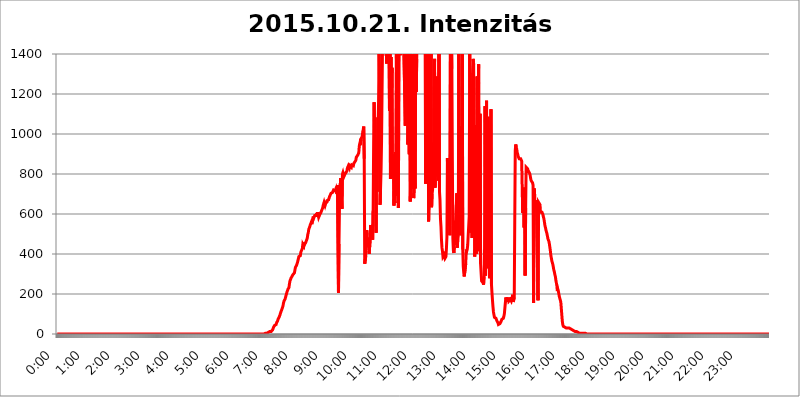
| Category | 2015.10.21. Intenzitás [W/m^2] |
|---|---|
| 0.0 | 0 |
| 0.0006944444444444445 | 0 |
| 0.001388888888888889 | 0 |
| 0.0020833333333333333 | 0 |
| 0.002777777777777778 | 0 |
| 0.003472222222222222 | 0 |
| 0.004166666666666667 | 0 |
| 0.004861111111111111 | 0 |
| 0.005555555555555556 | 0 |
| 0.0062499999999999995 | 0 |
| 0.006944444444444444 | 0 |
| 0.007638888888888889 | 0 |
| 0.008333333333333333 | 0 |
| 0.009027777777777779 | 0 |
| 0.009722222222222222 | 0 |
| 0.010416666666666666 | 0 |
| 0.011111111111111112 | 0 |
| 0.011805555555555555 | 0 |
| 0.012499999999999999 | 0 |
| 0.013194444444444444 | 0 |
| 0.013888888888888888 | 0 |
| 0.014583333333333332 | 0 |
| 0.015277777777777777 | 0 |
| 0.015972222222222224 | 0 |
| 0.016666666666666666 | 0 |
| 0.017361111111111112 | 0 |
| 0.018055555555555557 | 0 |
| 0.01875 | 0 |
| 0.019444444444444445 | 0 |
| 0.02013888888888889 | 0 |
| 0.020833333333333332 | 0 |
| 0.02152777777777778 | 0 |
| 0.022222222222222223 | 0 |
| 0.02291666666666667 | 0 |
| 0.02361111111111111 | 0 |
| 0.024305555555555556 | 0 |
| 0.024999999999999998 | 0 |
| 0.025694444444444447 | 0 |
| 0.02638888888888889 | 0 |
| 0.027083333333333334 | 0 |
| 0.027777777777777776 | 0 |
| 0.02847222222222222 | 0 |
| 0.029166666666666664 | 0 |
| 0.029861111111111113 | 0 |
| 0.030555555555555555 | 0 |
| 0.03125 | 0 |
| 0.03194444444444445 | 0 |
| 0.03263888888888889 | 0 |
| 0.03333333333333333 | 0 |
| 0.034027777777777775 | 0 |
| 0.034722222222222224 | 0 |
| 0.035416666666666666 | 0 |
| 0.036111111111111115 | 0 |
| 0.03680555555555556 | 0 |
| 0.0375 | 0 |
| 0.03819444444444444 | 0 |
| 0.03888888888888889 | 0 |
| 0.03958333333333333 | 0 |
| 0.04027777777777778 | 0 |
| 0.04097222222222222 | 0 |
| 0.041666666666666664 | 0 |
| 0.042361111111111106 | 0 |
| 0.04305555555555556 | 0 |
| 0.043750000000000004 | 0 |
| 0.044444444444444446 | 0 |
| 0.04513888888888889 | 0 |
| 0.04583333333333334 | 0 |
| 0.04652777777777778 | 0 |
| 0.04722222222222222 | 0 |
| 0.04791666666666666 | 0 |
| 0.04861111111111111 | 0 |
| 0.049305555555555554 | 0 |
| 0.049999999999999996 | 0 |
| 0.05069444444444445 | 0 |
| 0.051388888888888894 | 0 |
| 0.052083333333333336 | 0 |
| 0.05277777777777778 | 0 |
| 0.05347222222222222 | 0 |
| 0.05416666666666667 | 0 |
| 0.05486111111111111 | 0 |
| 0.05555555555555555 | 0 |
| 0.05625 | 0 |
| 0.05694444444444444 | 0 |
| 0.057638888888888885 | 0 |
| 0.05833333333333333 | 0 |
| 0.05902777777777778 | 0 |
| 0.059722222222222225 | 0 |
| 0.06041666666666667 | 0 |
| 0.061111111111111116 | 0 |
| 0.06180555555555556 | 0 |
| 0.0625 | 0 |
| 0.06319444444444444 | 0 |
| 0.06388888888888888 | 0 |
| 0.06458333333333334 | 0 |
| 0.06527777777777778 | 0 |
| 0.06597222222222222 | 0 |
| 0.06666666666666667 | 0 |
| 0.06736111111111111 | 0 |
| 0.06805555555555555 | 0 |
| 0.06874999999999999 | 0 |
| 0.06944444444444443 | 0 |
| 0.07013888888888889 | 0 |
| 0.07083333333333333 | 0 |
| 0.07152777777777779 | 0 |
| 0.07222222222222223 | 0 |
| 0.07291666666666667 | 0 |
| 0.07361111111111111 | 0 |
| 0.07430555555555556 | 0 |
| 0.075 | 0 |
| 0.07569444444444444 | 0 |
| 0.0763888888888889 | 0 |
| 0.07708333333333334 | 0 |
| 0.07777777777777778 | 0 |
| 0.07847222222222222 | 0 |
| 0.07916666666666666 | 0 |
| 0.0798611111111111 | 0 |
| 0.08055555555555556 | 0 |
| 0.08125 | 0 |
| 0.08194444444444444 | 0 |
| 0.08263888888888889 | 0 |
| 0.08333333333333333 | 0 |
| 0.08402777777777777 | 0 |
| 0.08472222222222221 | 0 |
| 0.08541666666666665 | 0 |
| 0.08611111111111112 | 0 |
| 0.08680555555555557 | 0 |
| 0.08750000000000001 | 0 |
| 0.08819444444444445 | 0 |
| 0.08888888888888889 | 0 |
| 0.08958333333333333 | 0 |
| 0.09027777777777778 | 0 |
| 0.09097222222222222 | 0 |
| 0.09166666666666667 | 0 |
| 0.09236111111111112 | 0 |
| 0.09305555555555556 | 0 |
| 0.09375 | 0 |
| 0.09444444444444444 | 0 |
| 0.09513888888888888 | 0 |
| 0.09583333333333333 | 0 |
| 0.09652777777777777 | 0 |
| 0.09722222222222222 | 0 |
| 0.09791666666666667 | 0 |
| 0.09861111111111111 | 0 |
| 0.09930555555555555 | 0 |
| 0.09999999999999999 | 0 |
| 0.10069444444444443 | 0 |
| 0.1013888888888889 | 0 |
| 0.10208333333333335 | 0 |
| 0.10277777777777779 | 0 |
| 0.10347222222222223 | 0 |
| 0.10416666666666667 | 0 |
| 0.10486111111111111 | 0 |
| 0.10555555555555556 | 0 |
| 0.10625 | 0 |
| 0.10694444444444444 | 0 |
| 0.1076388888888889 | 0 |
| 0.10833333333333334 | 0 |
| 0.10902777777777778 | 0 |
| 0.10972222222222222 | 0 |
| 0.1111111111111111 | 0 |
| 0.11180555555555556 | 0 |
| 0.11180555555555556 | 0 |
| 0.1125 | 0 |
| 0.11319444444444444 | 0 |
| 0.11388888888888889 | 0 |
| 0.11458333333333333 | 0 |
| 0.11527777777777777 | 0 |
| 0.11597222222222221 | 0 |
| 0.11666666666666665 | 0 |
| 0.1173611111111111 | 0 |
| 0.11805555555555557 | 0 |
| 0.11944444444444445 | 0 |
| 0.12013888888888889 | 0 |
| 0.12083333333333333 | 0 |
| 0.12152777777777778 | 0 |
| 0.12222222222222223 | 0 |
| 0.12291666666666667 | 0 |
| 0.12291666666666667 | 0 |
| 0.12361111111111112 | 0 |
| 0.12430555555555556 | 0 |
| 0.125 | 0 |
| 0.12569444444444444 | 0 |
| 0.12638888888888888 | 0 |
| 0.12708333333333333 | 0 |
| 0.16875 | 0 |
| 0.12847222222222224 | 0 |
| 0.12916666666666668 | 0 |
| 0.12986111111111112 | 0 |
| 0.13055555555555556 | 0 |
| 0.13125 | 0 |
| 0.13194444444444445 | 0 |
| 0.1326388888888889 | 0 |
| 0.13333333333333333 | 0 |
| 0.13402777777777777 | 0 |
| 0.13402777777777777 | 0 |
| 0.13472222222222222 | 0 |
| 0.13541666666666666 | 0 |
| 0.1361111111111111 | 0 |
| 0.13749999999999998 | 0 |
| 0.13819444444444443 | 0 |
| 0.1388888888888889 | 0 |
| 0.13958333333333334 | 0 |
| 0.14027777777777778 | 0 |
| 0.14097222222222222 | 0 |
| 0.14166666666666666 | 0 |
| 0.1423611111111111 | 0 |
| 0.14305555555555557 | 0 |
| 0.14375000000000002 | 0 |
| 0.14444444444444446 | 0 |
| 0.1451388888888889 | 0 |
| 0.1451388888888889 | 0 |
| 0.14652777777777778 | 0 |
| 0.14722222222222223 | 0 |
| 0.14791666666666667 | 0 |
| 0.1486111111111111 | 0 |
| 0.14930555555555555 | 0 |
| 0.15 | 0 |
| 0.15069444444444444 | 0 |
| 0.15138888888888888 | 0 |
| 0.15208333333333332 | 0 |
| 0.15277777777777776 | 0 |
| 0.15347222222222223 | 0 |
| 0.15416666666666667 | 0 |
| 0.15486111111111112 | 0 |
| 0.15555555555555556 | 0 |
| 0.15625 | 0 |
| 0.15694444444444444 | 0 |
| 0.15763888888888888 | 0 |
| 0.15833333333333333 | 0 |
| 0.15902777777777777 | 0 |
| 0.15972222222222224 | 0 |
| 0.16041666666666668 | 0 |
| 0.16111111111111112 | 0 |
| 0.16180555555555556 | 0 |
| 0.1625 | 0 |
| 0.16319444444444445 | 0 |
| 0.1638888888888889 | 0 |
| 0.16458333333333333 | 0 |
| 0.16527777777777777 | 0 |
| 0.16597222222222222 | 0 |
| 0.16666666666666666 | 0 |
| 0.1673611111111111 | 0 |
| 0.16805555555555554 | 0 |
| 0.16874999999999998 | 0 |
| 0.16944444444444443 | 0 |
| 0.17013888888888887 | 0 |
| 0.1708333333333333 | 0 |
| 0.17152777777777775 | 0 |
| 0.17222222222222225 | 0 |
| 0.1729166666666667 | 0 |
| 0.17361111111111113 | 0 |
| 0.17430555555555557 | 0 |
| 0.17500000000000002 | 0 |
| 0.17569444444444446 | 0 |
| 0.1763888888888889 | 0 |
| 0.17708333333333334 | 0 |
| 0.17777777777777778 | 0 |
| 0.17847222222222223 | 0 |
| 0.17916666666666667 | 0 |
| 0.1798611111111111 | 0 |
| 0.18055555555555555 | 0 |
| 0.18125 | 0 |
| 0.18194444444444444 | 0 |
| 0.1826388888888889 | 0 |
| 0.18333333333333335 | 0 |
| 0.1840277777777778 | 0 |
| 0.18472222222222223 | 0 |
| 0.18541666666666667 | 0 |
| 0.18611111111111112 | 0 |
| 0.18680555555555556 | 0 |
| 0.1875 | 0 |
| 0.18819444444444444 | 0 |
| 0.18888888888888888 | 0 |
| 0.18958333333333333 | 0 |
| 0.19027777777777777 | 0 |
| 0.1909722222222222 | 0 |
| 0.19166666666666665 | 0 |
| 0.19236111111111112 | 0 |
| 0.19305555555555554 | 0 |
| 0.19375 | 0 |
| 0.19444444444444445 | 0 |
| 0.1951388888888889 | 0 |
| 0.19583333333333333 | 0 |
| 0.19652777777777777 | 0 |
| 0.19722222222222222 | 0 |
| 0.19791666666666666 | 0 |
| 0.1986111111111111 | 0 |
| 0.19930555555555554 | 0 |
| 0.19999999999999998 | 0 |
| 0.20069444444444443 | 0 |
| 0.20138888888888887 | 0 |
| 0.2020833333333333 | 0 |
| 0.2027777777777778 | 0 |
| 0.2034722222222222 | 0 |
| 0.2041666666666667 | 0 |
| 0.20486111111111113 | 0 |
| 0.20555555555555557 | 0 |
| 0.20625000000000002 | 0 |
| 0.20694444444444446 | 0 |
| 0.2076388888888889 | 0 |
| 0.20833333333333334 | 0 |
| 0.20902777777777778 | 0 |
| 0.20972222222222223 | 0 |
| 0.21041666666666667 | 0 |
| 0.2111111111111111 | 0 |
| 0.21180555555555555 | 0 |
| 0.2125 | 0 |
| 0.21319444444444444 | 0 |
| 0.2138888888888889 | 0 |
| 0.21458333333333335 | 0 |
| 0.2152777777777778 | 0 |
| 0.21597222222222223 | 0 |
| 0.21666666666666667 | 0 |
| 0.21736111111111112 | 0 |
| 0.21805555555555556 | 0 |
| 0.21875 | 0 |
| 0.21944444444444444 | 0 |
| 0.22013888888888888 | 0 |
| 0.22083333333333333 | 0 |
| 0.22152777777777777 | 0 |
| 0.2222222222222222 | 0 |
| 0.22291666666666665 | 0 |
| 0.2236111111111111 | 0 |
| 0.22430555555555556 | 0 |
| 0.225 | 0 |
| 0.22569444444444445 | 0 |
| 0.2263888888888889 | 0 |
| 0.22708333333333333 | 0 |
| 0.22777777777777777 | 0 |
| 0.22847222222222222 | 0 |
| 0.22916666666666666 | 0 |
| 0.2298611111111111 | 0 |
| 0.23055555555555554 | 0 |
| 0.23124999999999998 | 0 |
| 0.23194444444444443 | 0 |
| 0.23263888888888887 | 0 |
| 0.2333333333333333 | 0 |
| 0.2340277777777778 | 0 |
| 0.2347222222222222 | 0 |
| 0.2354166666666667 | 0 |
| 0.23611111111111113 | 0 |
| 0.23680555555555557 | 0 |
| 0.23750000000000002 | 0 |
| 0.23819444444444446 | 0 |
| 0.2388888888888889 | 0 |
| 0.23958333333333334 | 0 |
| 0.24027777777777778 | 0 |
| 0.24097222222222223 | 0 |
| 0.24166666666666667 | 0 |
| 0.2423611111111111 | 0 |
| 0.24305555555555555 | 0 |
| 0.24375 | 0 |
| 0.24444444444444446 | 0 |
| 0.24513888888888888 | 0 |
| 0.24583333333333335 | 0 |
| 0.2465277777777778 | 0 |
| 0.24722222222222223 | 0 |
| 0.24791666666666667 | 0 |
| 0.24861111111111112 | 0 |
| 0.24930555555555556 | 0 |
| 0.25 | 0 |
| 0.25069444444444444 | 0 |
| 0.2513888888888889 | 0 |
| 0.2520833333333333 | 0 |
| 0.25277777777777777 | 0 |
| 0.2534722222222222 | 0 |
| 0.25416666666666665 | 0 |
| 0.2548611111111111 | 0 |
| 0.2555555555555556 | 0 |
| 0.25625000000000003 | 0 |
| 0.2569444444444445 | 0 |
| 0.2576388888888889 | 0 |
| 0.25833333333333336 | 0 |
| 0.2590277777777778 | 0 |
| 0.25972222222222224 | 0 |
| 0.2604166666666667 | 0 |
| 0.2611111111111111 | 0 |
| 0.26180555555555557 | 0 |
| 0.2625 | 0 |
| 0.26319444444444445 | 0 |
| 0.2638888888888889 | 0 |
| 0.26458333333333334 | 0 |
| 0.2652777777777778 | 0 |
| 0.2659722222222222 | 0 |
| 0.26666666666666666 | 0 |
| 0.2673611111111111 | 0 |
| 0.26805555555555555 | 0 |
| 0.26875 | 0 |
| 0.26944444444444443 | 0 |
| 0.2701388888888889 | 0 |
| 0.2708333333333333 | 0 |
| 0.27152777777777776 | 0 |
| 0.2722222222222222 | 0 |
| 0.27291666666666664 | 0 |
| 0.2736111111111111 | 0 |
| 0.2743055555555555 | 0 |
| 0.27499999999999997 | 0 |
| 0.27569444444444446 | 0 |
| 0.27638888888888885 | 0 |
| 0.27708333333333335 | 0 |
| 0.2777777777777778 | 0 |
| 0.27847222222222223 | 0 |
| 0.2791666666666667 | 0 |
| 0.2798611111111111 | 0 |
| 0.28055555555555556 | 0 |
| 0.28125 | 0 |
| 0.28194444444444444 | 0 |
| 0.2826388888888889 | 0 |
| 0.2833333333333333 | 0 |
| 0.28402777777777777 | 0 |
| 0.2847222222222222 | 0 |
| 0.28541666666666665 | 0 |
| 0.28611111111111115 | 0 |
| 0.28680555555555554 | 0 |
| 0.28750000000000003 | 0 |
| 0.2881944444444445 | 0 |
| 0.2888888888888889 | 0 |
| 0.28958333333333336 | 0 |
| 0.2902777777777778 | 0 |
| 0.29097222222222224 | 3.525 |
| 0.2916666666666667 | 3.525 |
| 0.2923611111111111 | 3.525 |
| 0.29305555555555557 | 3.525 |
| 0.29375 | 3.525 |
| 0.29444444444444445 | 3.525 |
| 0.2951388888888889 | 3.525 |
| 0.29583333333333334 | 7.887 |
| 0.2965277777777778 | 7.887 |
| 0.2972222222222222 | 7.887 |
| 0.29791666666666666 | 12.257 |
| 0.2986111111111111 | 12.257 |
| 0.29930555555555555 | 12.257 |
| 0.3 | 12.257 |
| 0.30069444444444443 | 16.636 |
| 0.3013888888888889 | 16.636 |
| 0.3020833333333333 | 21.024 |
| 0.30277777777777776 | 25.419 |
| 0.3034722222222222 | 34.234 |
| 0.30416666666666664 | 38.653 |
| 0.3048611111111111 | 43.079 |
| 0.3055555555555555 | 43.079 |
| 0.30624999999999997 | 47.511 |
| 0.3069444444444444 | 47.511 |
| 0.3076388888888889 | 56.398 |
| 0.30833333333333335 | 56.398 |
| 0.3090277777777778 | 65.31 |
| 0.30972222222222223 | 74.246 |
| 0.3104166666666667 | 78.722 |
| 0.3111111111111111 | 83.205 |
| 0.31180555555555556 | 87.692 |
| 0.3125 | 96.682 |
| 0.31319444444444444 | 105.69 |
| 0.3138888888888889 | 110.201 |
| 0.3145833333333333 | 119.235 |
| 0.31527777777777777 | 123.758 |
| 0.3159722222222222 | 132.814 |
| 0.31666666666666665 | 141.884 |
| 0.31736111111111115 | 155.509 |
| 0.31805555555555554 | 164.605 |
| 0.31875000000000003 | 169.156 |
| 0.3194444444444445 | 173.709 |
| 0.3201388888888889 | 178.264 |
| 0.32083333333333336 | 191.937 |
| 0.3215277777777778 | 201.058 |
| 0.32222222222222224 | 210.182 |
| 0.3229166666666667 | 214.746 |
| 0.3236111111111111 | 223.873 |
| 0.32430555555555557 | 228.436 |
| 0.325 | 233 |
| 0.32569444444444445 | 251.251 |
| 0.3263888888888889 | 264.932 |
| 0.32708333333333334 | 260.373 |
| 0.3277777777777778 | 278.603 |
| 0.3284722222222222 | 283.156 |
| 0.32916666666666666 | 287.709 |
| 0.3298611111111111 | 292.259 |
| 0.33055555555555555 | 296.808 |
| 0.33125 | 292.259 |
| 0.33194444444444443 | 292.259 |
| 0.3326388888888889 | 305.898 |
| 0.3333333333333333 | 319.517 |
| 0.3340277777777778 | 333.113 |
| 0.3347222222222222 | 337.639 |
| 0.3354166666666667 | 342.162 |
| 0.3361111111111111 | 337.639 |
| 0.3368055555555556 | 355.712 |
| 0.33749999999999997 | 360.221 |
| 0.33819444444444446 | 360.221 |
| 0.33888888888888885 | 387.202 |
| 0.33958333333333335 | 387.202 |
| 0.34027777777777773 | 391.685 |
| 0.34097222222222223 | 391.685 |
| 0.3416666666666666 | 409.574 |
| 0.3423611111111111 | 409.574 |
| 0.3430555555555555 | 409.574 |
| 0.34375 | 427.39 |
| 0.3444444444444445 | 449.551 |
| 0.3451388888888889 | 445.129 |
| 0.3458333333333334 | 440.702 |
| 0.34652777777777777 | 458.38 |
| 0.34722222222222227 | 449.551 |
| 0.34791666666666665 | 445.129 |
| 0.34861111111111115 | 458.38 |
| 0.34930555555555554 | 458.38 |
| 0.35000000000000003 | 462.786 |
| 0.3506944444444444 | 480.356 |
| 0.3513888888888889 | 497.836 |
| 0.3520833333333333 | 506.542 |
| 0.3527777777777778 | 523.88 |
| 0.3534722222222222 | 528.2 |
| 0.3541666666666667 | 536.82 |
| 0.3548611111111111 | 545.416 |
| 0.35555555555555557 | 549.704 |
| 0.35625 | 558.261 |
| 0.35694444444444445 | 549.704 |
| 0.3576388888888889 | 553.986 |
| 0.35833333333333334 | 571.049 |
| 0.3590277777777778 | 588.009 |
| 0.3597222222222222 | 579.542 |
| 0.36041666666666666 | 583.779 |
| 0.3611111111111111 | 592.233 |
| 0.36180555555555555 | 596.45 |
| 0.3625 | 596.45 |
| 0.36319444444444443 | 592.233 |
| 0.3638888888888889 | 604.864 |
| 0.3645833333333333 | 596.45 |
| 0.3652777777777778 | 609.062 |
| 0.3659722222222222 | 609.062 |
| 0.3666666666666667 | 583.779 |
| 0.3673611111111111 | 583.779 |
| 0.3680555555555556 | 596.45 |
| 0.36874999999999997 | 600.661 |
| 0.36944444444444446 | 604.864 |
| 0.37013888888888885 | 609.062 |
| 0.37083333333333335 | 617.436 |
| 0.37152777777777773 | 617.436 |
| 0.37222222222222223 | 629.948 |
| 0.3729166666666666 | 642.4 |
| 0.3736111111111111 | 650.667 |
| 0.3743055555555555 | 658.909 |
| 0.375 | 654.791 |
| 0.3756944444444445 | 642.4 |
| 0.3763888888888889 | 650.667 |
| 0.3770833333333334 | 663.019 |
| 0.37777777777777777 | 654.791 |
| 0.37847222222222227 | 667.123 |
| 0.37916666666666665 | 671.22 |
| 0.37986111111111115 | 671.22 |
| 0.38055555555555554 | 671.22 |
| 0.38125000000000003 | 679.395 |
| 0.3819444444444444 | 687.544 |
| 0.3826388888888889 | 683.473 |
| 0.3833333333333333 | 687.544 |
| 0.3840277777777778 | 703.762 |
| 0.3847222222222222 | 703.762 |
| 0.3854166666666667 | 703.762 |
| 0.3861111111111111 | 707.8 |
| 0.38680555555555557 | 707.8 |
| 0.3875 | 719.877 |
| 0.38819444444444445 | 723.889 |
| 0.3888888888888889 | 719.877 |
| 0.38958333333333334 | 715.858 |
| 0.3902777777777778 | 715.858 |
| 0.3909722222222222 | 727.896 |
| 0.39166666666666666 | 727.896 |
| 0.3923611111111111 | 699.717 |
| 0.39305555555555555 | 743.859 |
| 0.39375 | 739.877 |
| 0.39444444444444443 | 205.62 |
| 0.3951388888888889 | 449.551 |
| 0.3958333333333333 | 638.256 |
| 0.3965277777777778 | 629.948 |
| 0.3972222222222222 | 779.42 |
| 0.3979166666666667 | 779.42 |
| 0.3986111111111111 | 775.492 |
| 0.3993055555555556 | 625.784 |
| 0.39999999999999997 | 798.974 |
| 0.40069444444444446 | 806.757 |
| 0.40138888888888885 | 806.757 |
| 0.40208333333333335 | 787.258 |
| 0.40277777777777773 | 791.169 |
| 0.40347222222222223 | 798.974 |
| 0.4041666666666666 | 802.868 |
| 0.4048611111111111 | 806.757 |
| 0.4055555555555555 | 806.757 |
| 0.40625 | 814.519 |
| 0.4069444444444445 | 829.981 |
| 0.4076388888888889 | 829.981 |
| 0.4083333333333334 | 841.526 |
| 0.40902777777777777 | 841.526 |
| 0.40972222222222227 | 829.981 |
| 0.41041666666666665 | 841.526 |
| 0.41111111111111115 | 841.526 |
| 0.41180555555555554 | 837.682 |
| 0.41250000000000003 | 833.834 |
| 0.4131944444444444 | 845.365 |
| 0.4138888888888889 | 841.526 |
| 0.4145833333333333 | 841.526 |
| 0.4152777777777778 | 841.526 |
| 0.4159722222222222 | 853.029 |
| 0.4166666666666667 | 853.029 |
| 0.4173611111111111 | 860.676 |
| 0.41805555555555557 | 864.493 |
| 0.41875 | 868.305 |
| 0.41944444444444445 | 883.516 |
| 0.4201388888888889 | 879.719 |
| 0.42083333333333334 | 887.309 |
| 0.4215277777777778 | 894.885 |
| 0.4222222222222222 | 894.885 |
| 0.42291666666666666 | 906.223 |
| 0.4236111111111111 | 940.082 |
| 0.42430555555555555 | 951.327 |
| 0.425 | 943.832 |
| 0.42569444444444443 | 973.772 |
| 0.4263888888888889 | 977.508 |
| 0.4270833333333333 | 977.508 |
| 0.4277777777777778 | 988.714 |
| 0.4284722222222222 | 1011.118 |
| 0.4291666666666667 | 1022.323 |
| 0.4298611111111111 | 1037.277 |
| 0.4305555555555556 | 875.918 |
| 0.43124999999999997 | 351.198 |
| 0.43194444444444446 | 355.712 |
| 0.43263888888888885 | 387.202 |
| 0.43333333333333335 | 387.202 |
| 0.43402777777777773 | 519.555 |
| 0.43472222222222223 | 497.836 |
| 0.4354166666666666 | 458.38 |
| 0.4361111111111111 | 480.356 |
| 0.4368055555555555 | 431.833 |
| 0.4375 | 400.638 |
| 0.4381944444444445 | 396.164 |
| 0.4388888888888889 | 475.972 |
| 0.4395833333333334 | 545.416 |
| 0.44027777777777777 | 549.704 |
| 0.44097222222222227 | 545.416 |
| 0.44166666666666665 | 493.475 |
| 0.44236111111111115 | 471.582 |
| 0.44305555555555554 | 617.436 |
| 0.44375000000000003 | 955.071 |
| 0.4444444444444444 | 1158.689 |
| 0.4451388888888889 | 932.576 |
| 0.4458333333333333 | 1082.324 |
| 0.4465277777777778 | 719.877 |
| 0.4472222222222222 | 506.542 |
| 0.4479166666666667 | 932.576 |
| 0.4486111111111111 | 711.832 |
| 0.44930555555555557 | 966.295 |
| 0.45 | 1048.508 |
| 0.45069444444444445 | 1170.358 |
| 0.4513888888888889 | 1412.921 |
| 0.45208333333333334 | 1233.951 |
| 0.4527777777777778 | 646.537 |
| 0.4534722222222222 | 731.896 |
| 0.45416666666666666 | 818.392 |
| 0.4548611111111111 | 966.295 |
| 0.45555555555555555 | 966.295 |
| 0.45625 | 1451.653 |
| 0.45694444444444443 | 1481.743 |
| 0.4576388888888889 | 1471.609 |
| 0.4583333333333333 | 1471.609 |
| 0.4590277777777778 | 1507.556 |
| 0.4597222222222222 | 1502.338 |
| 0.4604166666666667 | 1476.663 |
| 0.4611111111111111 | 1486.851 |
| 0.4618055555555556 | 1352.994 |
| 0.46249999999999997 | 1471.609 |
| 0.46319444444444446 | 1466.581 |
| 0.46388888888888885 | 1471.609 |
| 0.46458333333333335 | 1436.949 |
| 0.46527777777777773 | 1507.556 |
| 0.46597222222222223 | 1116.426 |
| 0.4666666666666666 | 1466.581 |
| 0.4673611111111111 | 775.492 |
| 0.4680555555555555 | 1384.828 |
| 0.46875 | 1182.099 |
| 0.4694444444444445 | 1330.826 |
| 0.4701388888888889 | 779.42 |
| 0.4708333333333334 | 849.199 |
| 0.47152777777777777 | 898.668 |
| 0.47222222222222227 | 642.4 |
| 0.47291666666666665 | 723.889 |
| 0.47361111111111115 | 654.791 |
| 0.47430555555555554 | 909.996 |
| 0.47500000000000003 | 691.608 |
| 0.4756944444444444 | 1408.184 |
| 0.4763888888888889 | 1108.816 |
| 0.4770833333333333 | 1471.609 |
| 0.4777777777777778 | 1466.581 |
| 0.4784722222222222 | 629.948 |
| 0.4791666666666667 | 1441.826 |
| 0.4798611111111111 | 1422.462 |
| 0.48055555555555557 | 1417.68 |
| 0.48125 | 1394.106 |
| 0.48194444444444445 | 1412.921 |
| 0.4826388888888889 | 1417.68 |
| 0.48333333333333334 | 1422.462 |
| 0.4840277777777778 | 1422.462 |
| 0.4847222222222222 | 1422.462 |
| 0.48541666666666666 | 1422.462 |
| 0.4861111111111111 | 1432.097 |
| 0.48680555555555555 | 1432.097 |
| 0.4875 | 1436.949 |
| 0.48819444444444443 | 1041.019 |
| 0.4888888888888889 | 1466.581 |
| 0.4895833333333333 | 1352.994 |
| 0.4902777777777778 | 1481.743 |
| 0.4909722222222222 | 1432.097 |
| 0.4916666666666667 | 947.58 |
| 0.4923611111111111 | 1108.816 |
| 0.4930555555555556 | 1446.727 |
| 0.49374999999999997 | 898.668 |
| 0.49444444444444446 | 1471.609 |
| 0.49513888888888885 | 663.019 |
| 0.49583333333333335 | 798.974 |
| 0.49652777777777773 | 1502.338 |
| 0.49722222222222223 | 727.896 |
| 0.4979166666666666 | 1403.469 |
| 0.4986111111111111 | 1512.803 |
| 0.4993055555555555 | 1436.949 |
| 0.5 | 679.395 |
| 0.5006944444444444 | 775.492 |
| 0.5013888888888889 | 767.62 |
| 0.5020833333333333 | 727.896 |
| 0.5027777777777778 | 1502.338 |
| 0.5034722222222222 | 1209.807 |
| 0.5041666666666667 | 1375.633 |
| 0.5048611111111111 | 1512.803 |
| 0.5055555555555555 | 1497.148 |
| 0.50625 | 1512.803 |
| 0.5069444444444444 | 1512.803 |
| 0.5076388888888889 | 1497.148 |
| 0.5083333333333333 | 1497.148 |
| 0.5090277777777777 | 1408.184 |
| 0.5097222222222222 | 1461.58 |
| 0.5104166666666666 | 1451.653 |
| 0.5111111111111112 | 1446.727 |
| 0.5118055555555555 | 1441.826 |
| 0.5125000000000001 | 1461.58 |
| 0.5131944444444444 | 1436.949 |
| 0.513888888888889 | 1471.609 |
| 0.5145833333333333 | 1466.581 |
| 0.5152777777777778 | 1466.581 |
| 0.5159722222222222 | 1471.609 |
| 0.5166666666666667 | 751.803 |
| 0.517361111111111 | 1497.148 |
| 0.5180555555555556 | 1491.985 |
| 0.5187499999999999 | 984.98 |
| 0.5194444444444445 | 1486.851 |
| 0.5201388888888888 | 1304.795 |
| 0.5208333333333334 | 562.53 |
| 0.5215277777777778 | 667.123 |
| 0.5222222222222223 | 1539.476 |
| 0.5229166666666667 | 1502.338 |
| 0.5236111111111111 | 1041.019 |
| 0.5243055555555556 | 1481.743 |
| 0.525 | 634.105 |
| 0.5256944444444445 | 699.717 |
| 0.5263888888888889 | 719.877 |
| 0.5270833333333333 | 767.62 |
| 0.5277777777777778 | 958.814 |
| 0.5284722222222222 | 822.26 |
| 0.5291666666666667 | 1375.633 |
| 0.5298611111111111 | 731.896 |
| 0.5305555555555556 | 810.641 |
| 0.53125 | 1209.807 |
| 0.5319444444444444 | 1287.761 |
| 0.5326388888888889 | 883.516 |
| 0.5333333333333333 | 1041.019 |
| 0.5340277777777778 | 1074.789 |
| 0.5347222222222222 | 767.62 |
| 0.5354166666666667 | 1539.476 |
| 0.5361111111111111 | 711.832 |
| 0.5368055555555555 | 671.22 |
| 0.5375 | 575.299 |
| 0.5381944444444444 | 536.82 |
| 0.5388888888888889 | 471.582 |
| 0.5395833333333333 | 431.833 |
| 0.5402777777777777 | 414.035 |
| 0.5409722222222222 | 387.202 |
| 0.5416666666666666 | 387.202 |
| 0.5423611111111112 | 396.164 |
| 0.5430555555555555 | 387.202 |
| 0.5437500000000001 | 378.224 |
| 0.5444444444444444 | 378.224 |
| 0.545138888888889 | 387.202 |
| 0.5458333333333333 | 427.39 |
| 0.5465277777777778 | 484.735 |
| 0.5472222222222222 | 879.719 |
| 0.5479166666666667 | 883.516 |
| 0.548611111111111 | 553.986 |
| 0.5493055555555556 | 600.661 |
| 0.5499999999999999 | 579.542 |
| 0.5506944444444445 | 493.475 |
| 0.5513888888888888 | 1441.826 |
| 0.5520833333333334 | 1403.469 |
| 0.5527777777777778 | 1471.609 |
| 0.5534722222222223 | 1326.445 |
| 0.5541666666666667 | 864.493 |
| 0.5548611111111111 | 475.972 |
| 0.5555555555555556 | 418.492 |
| 0.55625 | 405.108 |
| 0.5569444444444445 | 436.27 |
| 0.5576388888888889 | 566.793 |
| 0.5583333333333333 | 467.187 |
| 0.5590277777777778 | 467.187 |
| 0.5597222222222222 | 646.537 |
| 0.5604166666666667 | 703.762 |
| 0.5611111111111111 | 431.833 |
| 0.5618055555555556 | 427.39 |
| 0.5625 | 523.88 |
| 0.5631944444444444 | 1422.462 |
| 0.5638888888888889 | 558.261 |
| 0.5645833333333333 | 1018.587 |
| 0.5652777777777778 | 1037.277 |
| 0.5659722222222222 | 493.475 |
| 0.5666666666666667 | 679.395 |
| 0.5673611111111111 | 629.948 |
| 0.5680555555555555 | 1417.68 |
| 0.56875 | 422.943 |
| 0.5694444444444444 | 337.639 |
| 0.5701388888888889 | 305.898 |
| 0.5708333333333333 | 287.709 |
| 0.5715277777777777 | 287.709 |
| 0.5722222222222222 | 292.259 |
| 0.5729166666666666 | 351.198 |
| 0.5736111111111112 | 422.943 |
| 0.5743055555555555 | 414.035 |
| 0.5750000000000001 | 422.943 |
| 0.5756944444444444 | 445.129 |
| 0.576388888888889 | 449.551 |
| 0.5770833333333333 | 445.129 |
| 0.5777777777777778 | 588.009 |
| 0.5784722222222222 | 1408.184 |
| 0.5791666666666667 | 1197.876 |
| 0.579861111111111 | 506.542 |
| 0.5805555555555556 | 528.2 |
| 0.5812499999999999 | 1254.387 |
| 0.5819444444444445 | 480.356 |
| 0.5826388888888888 | 1304.795 |
| 0.5833333333333334 | 1375.633 |
| 0.5840277777777778 | 1348.524 |
| 0.5847222222222223 | 875.918 |
| 0.5854166666666667 | 387.202 |
| 0.5861111111111111 | 422.943 |
| 0.5868055555555556 | 1044.762 |
| 0.5875 | 671.22 |
| 0.5881944444444445 | 400.638 |
| 0.5888888888888889 | 1287.761 |
| 0.5895833333333333 | 1283.541 |
| 0.5902777777777778 | 739.877 |
| 0.5909722222222222 | 1348.524 |
| 0.5916666666666667 | 414.035 |
| 0.5923611111111111 | 422.943 |
| 0.5930555555555556 | 1101.226 |
| 0.59375 | 351.198 |
| 0.5944444444444444 | 355.712 |
| 0.5951388888888889 | 264.932 |
| 0.5958333333333333 | 264.932 |
| 0.5965277777777778 | 269.49 |
| 0.5972222222222222 | 255.813 |
| 0.5979166666666667 | 246.689 |
| 0.5986111111111111 | 287.709 |
| 0.5993055555555555 | 427.39 |
| 0.6 | 1139.384 |
| 0.6006944444444444 | 292.259 |
| 0.6013888888888889 | 287.709 |
| 0.6020833333333333 | 1166.46 |
| 0.6027777777777777 | 328.584 |
| 0.6034722222222222 | 970.034 |
| 0.6041666666666666 | 1086.097 |
| 0.6048611111111112 | 1011.118 |
| 0.6055555555555555 | 502.192 |
| 0.6062500000000001 | 278.603 |
| 0.6069444444444444 | 301.354 |
| 0.607638888888889 | 324.052 |
| 0.6083333333333333 | 1124.056 |
| 0.6090277777777778 | 246.689 |
| 0.6097222222222222 | 205.62 |
| 0.6104166666666667 | 169.156 |
| 0.611111111111111 | 137.347 |
| 0.6118055555555556 | 110.201 |
| 0.6124999999999999 | 96.682 |
| 0.6131944444444445 | 83.205 |
| 0.6138888888888888 | 83.205 |
| 0.6145833333333334 | 78.722 |
| 0.6152777777777778 | 78.722 |
| 0.6159722222222223 | 74.246 |
| 0.6166666666666667 | 65.31 |
| 0.6173611111111111 | 60.85 |
| 0.6180555555555556 | 56.398 |
| 0.61875 | 47.511 |
| 0.6194444444444445 | 47.511 |
| 0.6201388888888889 | 47.511 |
| 0.6208333333333333 | 51.951 |
| 0.6215277777777778 | 56.398 |
| 0.6222222222222222 | 60.85 |
| 0.6229166666666667 | 65.31 |
| 0.6236111111111111 | 74.246 |
| 0.6243055555555556 | 78.722 |
| 0.625 | 78.722 |
| 0.6256944444444444 | 78.722 |
| 0.6263888888888889 | 87.692 |
| 0.6270833333333333 | 101.184 |
| 0.6277777777777778 | 128.284 |
| 0.6284722222222222 | 155.509 |
| 0.6291666666666667 | 182.82 |
| 0.6298611111111111 | 187.378 |
| 0.6305555555555555 | 178.264 |
| 0.63125 | 160.056 |
| 0.6319444444444444 | 173.709 |
| 0.6326388888888889 | 182.82 |
| 0.6333333333333333 | 164.605 |
| 0.6340277777777777 | 164.605 |
| 0.6347222222222222 | 164.605 |
| 0.6354166666666666 | 173.709 |
| 0.6361111111111112 | 178.264 |
| 0.6368055555555555 | 164.605 |
| 0.6375000000000001 | 169.156 |
| 0.6381944444444444 | 182.82 |
| 0.638888888888889 | 196.497 |
| 0.6395833333333333 | 160.056 |
| 0.6402777777777778 | 164.605 |
| 0.6409722222222222 | 182.82 |
| 0.6416666666666667 | 566.793 |
| 0.642361111111111 | 917.534 |
| 0.6430555555555556 | 947.58 |
| 0.6437499999999999 | 932.576 |
| 0.6444444444444445 | 925.06 |
| 0.6451388888888888 | 906.223 |
| 0.6458333333333334 | 898.668 |
| 0.6465277777777778 | 887.309 |
| 0.6472222222222223 | 887.309 |
| 0.6479166666666667 | 875.918 |
| 0.6486111111111111 | 872.114 |
| 0.6493055555555556 | 872.114 |
| 0.65 | 875.918 |
| 0.6506944444444445 | 872.114 |
| 0.6513888888888889 | 864.493 |
| 0.6520833333333333 | 860.676 |
| 0.6527777777777778 | 604.864 |
| 0.6534722222222222 | 629.948 |
| 0.6541666666666667 | 727.896 |
| 0.6548611111111111 | 532.513 |
| 0.6555555555555556 | 731.896 |
| 0.65625 | 292.259 |
| 0.6569444444444444 | 629.948 |
| 0.6576388888888889 | 833.834 |
| 0.6583333333333333 | 829.981 |
| 0.6590277777777778 | 833.834 |
| 0.6597222222222222 | 826.123 |
| 0.6604166666666667 | 818.392 |
| 0.6611111111111111 | 818.392 |
| 0.6618055555555555 | 814.519 |
| 0.6625 | 802.868 |
| 0.6631944444444444 | 795.074 |
| 0.6638888888888889 | 779.42 |
| 0.6645833333333333 | 767.62 |
| 0.6652777777777777 | 767.62 |
| 0.6659722222222222 | 763.674 |
| 0.6666666666666666 | 755.766 |
| 0.6673611111111111 | 743.859 |
| 0.6680555555555556 | 155.509 |
| 0.6687500000000001 | 727.896 |
| 0.6694444444444444 | 711.832 |
| 0.6701388888888888 | 625.784 |
| 0.6708333333333334 | 667.123 |
| 0.6715277777777778 | 658.909 |
| 0.6722222222222222 | 667.123 |
| 0.6729166666666666 | 667.123 |
| 0.6736111111111112 | 667.123 |
| 0.6743055555555556 | 169.156 |
| 0.6749999999999999 | 658.909 |
| 0.6756944444444444 | 658.909 |
| 0.6763888888888889 | 658.909 |
| 0.6770833333333334 | 646.537 |
| 0.6777777777777777 | 609.062 |
| 0.6784722222222223 | 613.252 |
| 0.6791666666666667 | 609.062 |
| 0.6798611111111111 | 609.062 |
| 0.6805555555555555 | 604.864 |
| 0.68125 | 596.45 |
| 0.6819444444444445 | 583.779 |
| 0.6826388888888889 | 575.299 |
| 0.6833333333333332 | 558.261 |
| 0.6840277777777778 | 541.121 |
| 0.6847222222222222 | 532.513 |
| 0.6854166666666667 | 519.555 |
| 0.686111111111111 | 510.885 |
| 0.6868055555555556 | 502.192 |
| 0.6875 | 489.108 |
| 0.6881944444444444 | 475.972 |
| 0.688888888888889 | 471.582 |
| 0.6895833333333333 | 462.786 |
| 0.6902777777777778 | 449.551 |
| 0.6909722222222222 | 431.833 |
| 0.6916666666666668 | 414.035 |
| 0.6923611111111111 | 391.685 |
| 0.6930555555555555 | 378.224 |
| 0.69375 | 364.728 |
| 0.6944444444444445 | 355.712 |
| 0.6951388888888889 | 346.682 |
| 0.6958333333333333 | 333.113 |
| 0.6965277777777777 | 319.517 |
| 0.6972222222222223 | 310.44 |
| 0.6979166666666666 | 296.808 |
| 0.6986111111111111 | 287.709 |
| 0.6993055555555556 | 269.49 |
| 0.7000000000000001 | 255.813 |
| 0.7006944444444444 | 242.127 |
| 0.7013888888888888 | 214.746 |
| 0.7020833333333334 | 223.873 |
| 0.7027777777777778 | 214.746 |
| 0.7034722222222222 | 201.058 |
| 0.7041666666666666 | 187.378 |
| 0.7048611111111112 | 178.264 |
| 0.7055555555555556 | 169.156 |
| 0.7062499999999999 | 160.056 |
| 0.7069444444444444 | 128.284 |
| 0.7076388888888889 | 96.682 |
| 0.7083333333333334 | 65.31 |
| 0.7090277777777777 | 47.511 |
| 0.7097222222222223 | 38.653 |
| 0.7104166666666667 | 38.653 |
| 0.7111111111111111 | 34.234 |
| 0.7118055555555555 | 34.234 |
| 0.7125 | 34.234 |
| 0.7131944444444445 | 34.234 |
| 0.7138888888888889 | 29.823 |
| 0.7145833333333332 | 29.823 |
| 0.7152777777777778 | 29.823 |
| 0.7159722222222222 | 29.823 |
| 0.7166666666666667 | 25.419 |
| 0.717361111111111 | 29.823 |
| 0.7180555555555556 | 29.823 |
| 0.71875 | 25.419 |
| 0.7194444444444444 | 25.419 |
| 0.720138888888889 | 25.419 |
| 0.7208333333333333 | 25.419 |
| 0.7215277777777778 | 21.024 |
| 0.7222222222222222 | 21.024 |
| 0.7229166666666668 | 21.024 |
| 0.7236111111111111 | 21.024 |
| 0.7243055555555555 | 16.636 |
| 0.725 | 16.636 |
| 0.7256944444444445 | 16.636 |
| 0.7263888888888889 | 12.257 |
| 0.7270833333333333 | 12.257 |
| 0.7277777777777777 | 12.257 |
| 0.7284722222222223 | 12.257 |
| 0.7291666666666666 | 7.887 |
| 0.7298611111111111 | 7.887 |
| 0.7305555555555556 | 7.887 |
| 0.7312500000000001 | 7.887 |
| 0.7319444444444444 | 3.525 |
| 0.7326388888888888 | 3.525 |
| 0.7333333333333334 | 3.525 |
| 0.7340277777777778 | 3.525 |
| 0.7347222222222222 | 3.525 |
| 0.7354166666666666 | 3.525 |
| 0.7361111111111112 | 3.525 |
| 0.7368055555555556 | 3.525 |
| 0.7374999999999999 | 3.525 |
| 0.7381944444444444 | 3.525 |
| 0.7388888888888889 | 3.525 |
| 0.7395833333333334 | 3.525 |
| 0.7402777777777777 | 0 |
| 0.7409722222222223 | 3.525 |
| 0.7416666666666667 | 0 |
| 0.7423611111111111 | 0 |
| 0.7430555555555555 | 0 |
| 0.74375 | 0 |
| 0.7444444444444445 | 0 |
| 0.7451388888888889 | 0 |
| 0.7458333333333332 | 0 |
| 0.7465277777777778 | 0 |
| 0.7472222222222222 | 0 |
| 0.7479166666666667 | 0 |
| 0.748611111111111 | 0 |
| 0.7493055555555556 | 0 |
| 0.75 | 0 |
| 0.7506944444444444 | 0 |
| 0.751388888888889 | 0 |
| 0.7520833333333333 | 0 |
| 0.7527777777777778 | 0 |
| 0.7534722222222222 | 0 |
| 0.7541666666666668 | 0 |
| 0.7548611111111111 | 0 |
| 0.7555555555555555 | 0 |
| 0.75625 | 0 |
| 0.7569444444444445 | 0 |
| 0.7576388888888889 | 0 |
| 0.7583333333333333 | 0 |
| 0.7590277777777777 | 0 |
| 0.7597222222222223 | 0 |
| 0.7604166666666666 | 0 |
| 0.7611111111111111 | 0 |
| 0.7618055555555556 | 0 |
| 0.7625000000000001 | 0 |
| 0.7631944444444444 | 0 |
| 0.7638888888888888 | 0 |
| 0.7645833333333334 | 0 |
| 0.7652777777777778 | 0 |
| 0.7659722222222222 | 0 |
| 0.7666666666666666 | 0 |
| 0.7673611111111112 | 0 |
| 0.7680555555555556 | 0 |
| 0.7687499999999999 | 0 |
| 0.7694444444444444 | 0 |
| 0.7701388888888889 | 0 |
| 0.7708333333333334 | 0 |
| 0.7715277777777777 | 0 |
| 0.7722222222222223 | 0 |
| 0.7729166666666667 | 0 |
| 0.7736111111111111 | 0 |
| 0.7743055555555555 | 0 |
| 0.775 | 0 |
| 0.7756944444444445 | 0 |
| 0.7763888888888889 | 0 |
| 0.7770833333333332 | 0 |
| 0.7777777777777778 | 0 |
| 0.7784722222222222 | 0 |
| 0.7791666666666667 | 0 |
| 0.779861111111111 | 0 |
| 0.7805555555555556 | 0 |
| 0.78125 | 0 |
| 0.7819444444444444 | 0 |
| 0.782638888888889 | 0 |
| 0.7833333333333333 | 0 |
| 0.7840277777777778 | 0 |
| 0.7847222222222222 | 0 |
| 0.7854166666666668 | 0 |
| 0.7861111111111111 | 0 |
| 0.7868055555555555 | 0 |
| 0.7875 | 0 |
| 0.7881944444444445 | 0 |
| 0.7888888888888889 | 0 |
| 0.7895833333333333 | 0 |
| 0.7902777777777777 | 0 |
| 0.7909722222222223 | 0 |
| 0.7916666666666666 | 0 |
| 0.7923611111111111 | 0 |
| 0.7930555555555556 | 0 |
| 0.7937500000000001 | 0 |
| 0.7944444444444444 | 0 |
| 0.7951388888888888 | 0 |
| 0.7958333333333334 | 0 |
| 0.7965277777777778 | 0 |
| 0.7972222222222222 | 0 |
| 0.7979166666666666 | 0 |
| 0.7986111111111112 | 0 |
| 0.7993055555555556 | 0 |
| 0.7999999999999999 | 0 |
| 0.8006944444444444 | 0 |
| 0.8013888888888889 | 0 |
| 0.8020833333333334 | 0 |
| 0.8027777777777777 | 0 |
| 0.8034722222222223 | 0 |
| 0.8041666666666667 | 0 |
| 0.8048611111111111 | 0 |
| 0.8055555555555555 | 0 |
| 0.80625 | 0 |
| 0.8069444444444445 | 0 |
| 0.8076388888888889 | 0 |
| 0.8083333333333332 | 0 |
| 0.8090277777777778 | 0 |
| 0.8097222222222222 | 0 |
| 0.8104166666666667 | 0 |
| 0.811111111111111 | 0 |
| 0.8118055555555556 | 0 |
| 0.8125 | 0 |
| 0.8131944444444444 | 0 |
| 0.813888888888889 | 0 |
| 0.8145833333333333 | 0 |
| 0.8152777777777778 | 0 |
| 0.8159722222222222 | 0 |
| 0.8166666666666668 | 0 |
| 0.8173611111111111 | 0 |
| 0.8180555555555555 | 0 |
| 0.81875 | 0 |
| 0.8194444444444445 | 0 |
| 0.8201388888888889 | 0 |
| 0.8208333333333333 | 0 |
| 0.8215277777777777 | 0 |
| 0.8222222222222223 | 0 |
| 0.8229166666666666 | 0 |
| 0.8236111111111111 | 0 |
| 0.8243055555555556 | 0 |
| 0.8250000000000001 | 0 |
| 0.8256944444444444 | 0 |
| 0.8263888888888888 | 0 |
| 0.8270833333333334 | 0 |
| 0.8277777777777778 | 0 |
| 0.8284722222222222 | 0 |
| 0.8291666666666666 | 0 |
| 0.8298611111111112 | 0 |
| 0.8305555555555556 | 0 |
| 0.8312499999999999 | 0 |
| 0.8319444444444444 | 0 |
| 0.8326388888888889 | 0 |
| 0.8333333333333334 | 0 |
| 0.8340277777777777 | 0 |
| 0.8347222222222223 | 0 |
| 0.8354166666666667 | 0 |
| 0.8361111111111111 | 0 |
| 0.8368055555555555 | 0 |
| 0.8375 | 0 |
| 0.8381944444444445 | 0 |
| 0.8388888888888889 | 0 |
| 0.8395833333333332 | 0 |
| 0.8402777777777778 | 0 |
| 0.8409722222222222 | 0 |
| 0.8416666666666667 | 0 |
| 0.842361111111111 | 0 |
| 0.8430555555555556 | 0 |
| 0.84375 | 0 |
| 0.8444444444444444 | 0 |
| 0.845138888888889 | 0 |
| 0.8458333333333333 | 0 |
| 0.8465277777777778 | 0 |
| 0.8472222222222222 | 0 |
| 0.8479166666666668 | 0 |
| 0.8486111111111111 | 0 |
| 0.8493055555555555 | 0 |
| 0.85 | 0 |
| 0.8506944444444445 | 0 |
| 0.8513888888888889 | 0 |
| 0.8520833333333333 | 0 |
| 0.8527777777777777 | 0 |
| 0.8534722222222223 | 0 |
| 0.8541666666666666 | 0 |
| 0.8548611111111111 | 0 |
| 0.8555555555555556 | 0 |
| 0.8562500000000001 | 0 |
| 0.8569444444444444 | 0 |
| 0.8576388888888888 | 0 |
| 0.8583333333333334 | 0 |
| 0.8590277777777778 | 0 |
| 0.8597222222222222 | 0 |
| 0.8604166666666666 | 0 |
| 0.8611111111111112 | 0 |
| 0.8618055555555556 | 0 |
| 0.8624999999999999 | 0 |
| 0.8631944444444444 | 0 |
| 0.8638888888888889 | 0 |
| 0.8645833333333334 | 0 |
| 0.8652777777777777 | 0 |
| 0.8659722222222223 | 0 |
| 0.8666666666666667 | 0 |
| 0.8673611111111111 | 0 |
| 0.8680555555555555 | 0 |
| 0.86875 | 0 |
| 0.8694444444444445 | 0 |
| 0.8701388888888889 | 0 |
| 0.8708333333333332 | 0 |
| 0.8715277777777778 | 0 |
| 0.8722222222222222 | 0 |
| 0.8729166666666667 | 0 |
| 0.873611111111111 | 0 |
| 0.8743055555555556 | 0 |
| 0.875 | 0 |
| 0.8756944444444444 | 0 |
| 0.876388888888889 | 0 |
| 0.8770833333333333 | 0 |
| 0.8777777777777778 | 0 |
| 0.8784722222222222 | 0 |
| 0.8791666666666668 | 0 |
| 0.8798611111111111 | 0 |
| 0.8805555555555555 | 0 |
| 0.88125 | 0 |
| 0.8819444444444445 | 0 |
| 0.8826388888888889 | 0 |
| 0.8833333333333333 | 0 |
| 0.8840277777777777 | 0 |
| 0.8847222222222223 | 0 |
| 0.8854166666666666 | 0 |
| 0.8861111111111111 | 0 |
| 0.8868055555555556 | 0 |
| 0.8875000000000001 | 0 |
| 0.8881944444444444 | 0 |
| 0.8888888888888888 | 0 |
| 0.8895833333333334 | 0 |
| 0.8902777777777778 | 0 |
| 0.8909722222222222 | 0 |
| 0.8916666666666666 | 0 |
| 0.8923611111111112 | 0 |
| 0.8930555555555556 | 0 |
| 0.8937499999999999 | 0 |
| 0.8944444444444444 | 0 |
| 0.8951388888888889 | 0 |
| 0.8958333333333334 | 0 |
| 0.8965277777777777 | 0 |
| 0.8972222222222223 | 0 |
| 0.8979166666666667 | 0 |
| 0.8986111111111111 | 0 |
| 0.8993055555555555 | 0 |
| 0.9 | 0 |
| 0.9006944444444445 | 0 |
| 0.9013888888888889 | 0 |
| 0.9020833333333332 | 0 |
| 0.9027777777777778 | 0 |
| 0.9034722222222222 | 0 |
| 0.9041666666666667 | 0 |
| 0.904861111111111 | 0 |
| 0.9055555555555556 | 0 |
| 0.90625 | 0 |
| 0.9069444444444444 | 0 |
| 0.907638888888889 | 0 |
| 0.9083333333333333 | 0 |
| 0.9090277777777778 | 0 |
| 0.9097222222222222 | 0 |
| 0.9104166666666668 | 0 |
| 0.9111111111111111 | 0 |
| 0.9118055555555555 | 0 |
| 0.9125 | 0 |
| 0.9131944444444445 | 0 |
| 0.9138888888888889 | 0 |
| 0.9145833333333333 | 0 |
| 0.9152777777777777 | 0 |
| 0.9159722222222223 | 0 |
| 0.9166666666666666 | 0 |
| 0.9173611111111111 | 0 |
| 0.9180555555555556 | 0 |
| 0.9187500000000001 | 0 |
| 0.9194444444444444 | 0 |
| 0.9201388888888888 | 0 |
| 0.9208333333333334 | 0 |
| 0.9215277777777778 | 0 |
| 0.9222222222222222 | 0 |
| 0.9229166666666666 | 0 |
| 0.9236111111111112 | 0 |
| 0.9243055555555556 | 0 |
| 0.9249999999999999 | 0 |
| 0.9256944444444444 | 0 |
| 0.9263888888888889 | 0 |
| 0.9270833333333334 | 0 |
| 0.9277777777777777 | 0 |
| 0.9284722222222223 | 0 |
| 0.9291666666666667 | 0 |
| 0.9298611111111111 | 0 |
| 0.9305555555555555 | 0 |
| 0.93125 | 0 |
| 0.9319444444444445 | 0 |
| 0.9326388888888889 | 0 |
| 0.9333333333333332 | 0 |
| 0.9340277777777778 | 0 |
| 0.9347222222222222 | 0 |
| 0.9354166666666667 | 0 |
| 0.936111111111111 | 0 |
| 0.9368055555555556 | 0 |
| 0.9375 | 0 |
| 0.9381944444444444 | 0 |
| 0.938888888888889 | 0 |
| 0.9395833333333333 | 0 |
| 0.9402777777777778 | 0 |
| 0.9409722222222222 | 0 |
| 0.9416666666666668 | 0 |
| 0.9423611111111111 | 0 |
| 0.9430555555555555 | 0 |
| 0.94375 | 0 |
| 0.9444444444444445 | 0 |
| 0.9451388888888889 | 0 |
| 0.9458333333333333 | 0 |
| 0.9465277777777777 | 0 |
| 0.9472222222222223 | 0 |
| 0.9479166666666666 | 0 |
| 0.9486111111111111 | 0 |
| 0.9493055555555556 | 0 |
| 0.9500000000000001 | 0 |
| 0.9506944444444444 | 0 |
| 0.9513888888888888 | 0 |
| 0.9520833333333334 | 0 |
| 0.9527777777777778 | 0 |
| 0.9534722222222222 | 0 |
| 0.9541666666666666 | 0 |
| 0.9548611111111112 | 0 |
| 0.9555555555555556 | 0 |
| 0.9562499999999999 | 0 |
| 0.9569444444444444 | 0 |
| 0.9576388888888889 | 0 |
| 0.9583333333333334 | 0 |
| 0.9590277777777777 | 0 |
| 0.9597222222222223 | 0 |
| 0.9604166666666667 | 0 |
| 0.9611111111111111 | 0 |
| 0.9618055555555555 | 0 |
| 0.9625 | 0 |
| 0.9631944444444445 | 0 |
| 0.9638888888888889 | 0 |
| 0.9645833333333332 | 0 |
| 0.9652777777777778 | 0 |
| 0.9659722222222222 | 0 |
| 0.9666666666666667 | 0 |
| 0.967361111111111 | 0 |
| 0.9680555555555556 | 0 |
| 0.96875 | 0 |
| 0.9694444444444444 | 0 |
| 0.970138888888889 | 0 |
| 0.9708333333333333 | 0 |
| 0.9715277777777778 | 0 |
| 0.9722222222222222 | 0 |
| 0.9729166666666668 | 0 |
| 0.9736111111111111 | 0 |
| 0.9743055555555555 | 0 |
| 0.975 | 0 |
| 0.9756944444444445 | 0 |
| 0.9763888888888889 | 0 |
| 0.9770833333333333 | 0 |
| 0.9777777777777777 | 0 |
| 0.9784722222222223 | 0 |
| 0.9791666666666666 | 0 |
| 0.9798611111111111 | 0 |
| 0.9805555555555556 | 0 |
| 0.9812500000000001 | 0 |
| 0.9819444444444444 | 0 |
| 0.9826388888888888 | 0 |
| 0.9833333333333334 | 0 |
| 0.9840277777777778 | 0 |
| 0.9847222222222222 | 0 |
| 0.9854166666666666 | 0 |
| 0.9861111111111112 | 0 |
| 0.9868055555555556 | 0 |
| 0.9874999999999999 | 0 |
| 0.9881944444444444 | 0 |
| 0.9888888888888889 | 0 |
| 0.9895833333333334 | 0 |
| 0.9902777777777777 | 0 |
| 0.9909722222222223 | 0 |
| 0.9916666666666667 | 0 |
| 0.9923611111111111 | 0 |
| 0.9930555555555555 | 0 |
| 0.99375 | 0 |
| 0.9944444444444445 | 0 |
| 0.9951388888888889 | 0 |
| 0.9958333333333332 | 0 |
| 0.9965277777777778 | 0 |
| 0.9972222222222222 | 0 |
| 0.9979166666666667 | 0 |
| 0.998611111111111 | 0 |
| 0.9993055555555556 | 0 |